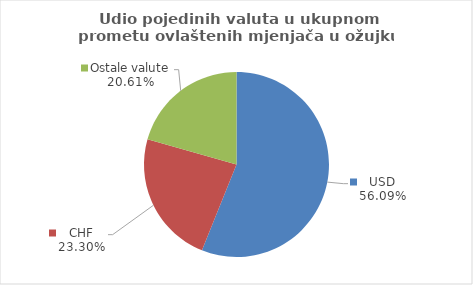
| Category | Series 0 |
|---|---|
| USD | 56.092 |
| CHF | 23.294 |
| Ostale valute | 20.613 |